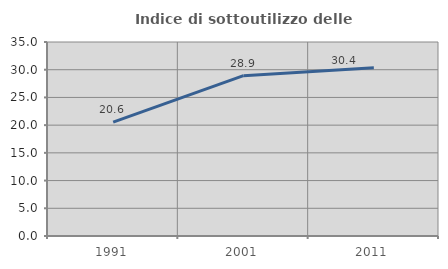
| Category | Indice di sottoutilizzo delle abitazioni  |
|---|---|
| 1991.0 | 20.552 |
| 2001.0 | 28.931 |
| 2011.0 | 30.357 |